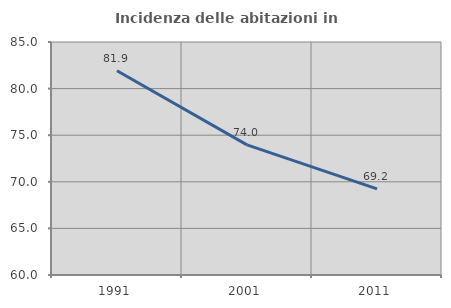
| Category | Incidenza delle abitazioni in proprietà  |
|---|---|
| 1991.0 | 81.908 |
| 2001.0 | 73.963 |
| 2011.0 | 69.238 |